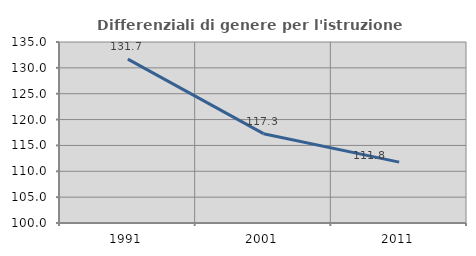
| Category | Differenziali di genere per l'istruzione superiore |
|---|---|
| 1991.0 | 131.684 |
| 2001.0 | 117.276 |
| 2011.0 | 111.765 |